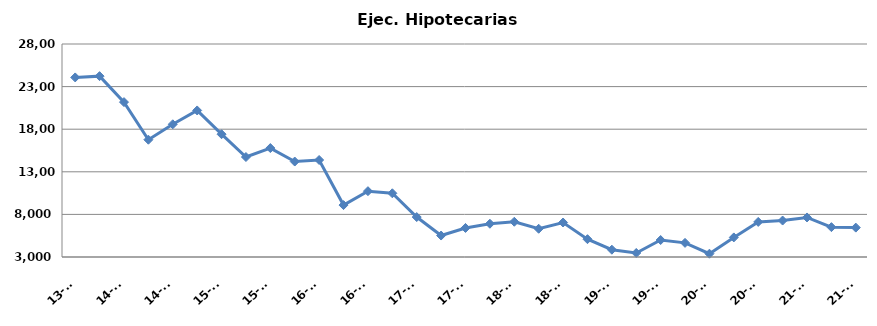
| Category | Ej. Hipotecarias |
|---|---|
| 13-T4 | 24076 |
| 14-T1 | 24226 |
| 14-T2 | 21178 |
| 14-T3 | 16767 |
| 14-T4 | 18578 |
| 15-T1 | 20201 |
| 15-T2 | 17414 |
| 15-T3 | 14735 |
| 15-T4 | 15785 |
| 16-T1 | 14205 |
| 16-T2 | 14385 |
| 16-T3 | 9094 |
| 16-T4 | 10726 |
| 17-T1 | 10478 |
| 17-T2 | 7689 |
| 17-T3 | 5518 |
| 17-T4 | 6409 |
| 18-T1 | 6903 |
| 18-T2 | 7137 |
| 18-T3 | 6315 |
| 18-T4 | 7049 |
| 19-T1 | 5092 |
| 19-T2 | 3857 |
| 19-T3 | 3470 |
| 19-T4 | 4992 |
| 20-T1 | 4658 |
| 20-T2 | 3387 |
| 20-T3 | 5299 |
| 20-T4 | 7116 |
| 21-T1 | 7280 |
| 21-T2 | 7641 |
| 21-T3 | 6504 |
| 21-T4 | 6449 |